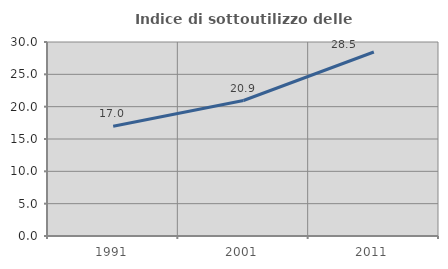
| Category | Indice di sottoutilizzo delle abitazioni  |
|---|---|
| 1991.0 | 16.979 |
| 2001.0 | 20.949 |
| 2011.0 | 28.458 |